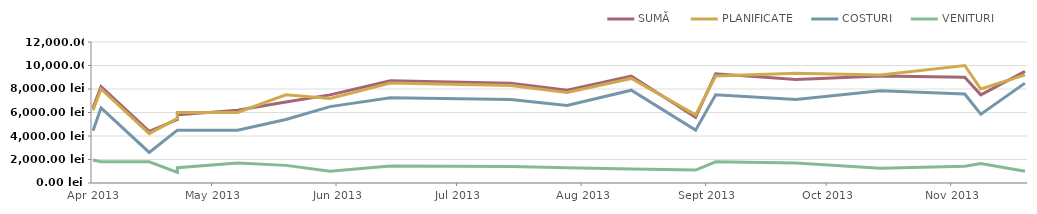
| Category | SUMĂ | PLANIFICATE | COSTURI | VENITURI |
|---|---|---|---|---|
| 2013-04-23 | 6400 | 6200 | 4450 | 1950 |
| 2013-04-25 | 8200 | 8000 | 6400 | 1800 |
| 2013-05-07 | 4400 | 4200 | 2600 | 1800 |
| 2013-05-14 | 5400 | 5500 | 4500 | 900 |
| 2013-05-14 | 5800 | 6000 | 4500 | 1300 |
| 2013-05-29 | 6200 | 6000 | 4500 | 1700 |
| 2013-06-10 | 6900 | 7500 | 5400 | 1500 |
| 2013-06-21 | 7500 | 7200 | 6500 | 1000 |
| 2013-07-06 | 8700 | 8500 | 7250 | 1450 |
| 2013-08-05 | 8500 | 8300 | 7100 | 1400 |
| 2013-08-19 | 7900 | 7700 | 6600 | 1300 |
| 2013-09-04 | 9100 | 8900 | 7900 | 1200 |
| 2013-09-20 | 5600 | 5800 | 4500 | 1100 |
| 2013-09-25 | 9300 | 9100 | 7500 | 1800 |
| 2013-10-15 | 8800 | 9350 | 7100 | 1700 |
| 2013-11-05 | 9100 | 9200 | 7850 | 1250 |
| 2013-11-26 | 9000 | 10000 | 7575 | 1425 |
| 2013-11-30 | 7500 | 8000 | 5850 | 1650 |
| 2013-12-11 | 9500 | 9200 | 8500 | 1000 |